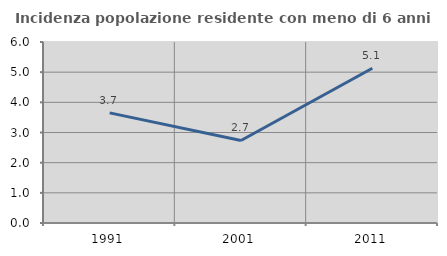
| Category | Incidenza popolazione residente con meno di 6 anni |
|---|---|
| 1991.0 | 3.651 |
| 2001.0 | 2.735 |
| 2011.0 | 5.128 |